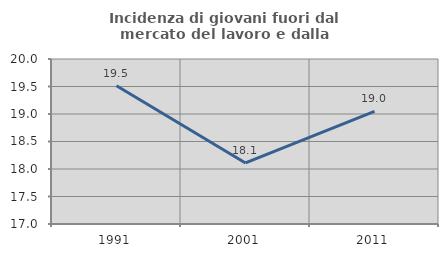
| Category | Incidenza di giovani fuori dal mercato del lavoro e dalla formazione  |
|---|---|
| 1991.0 | 19.512 |
| 2001.0 | 18.11 |
| 2011.0 | 19.048 |